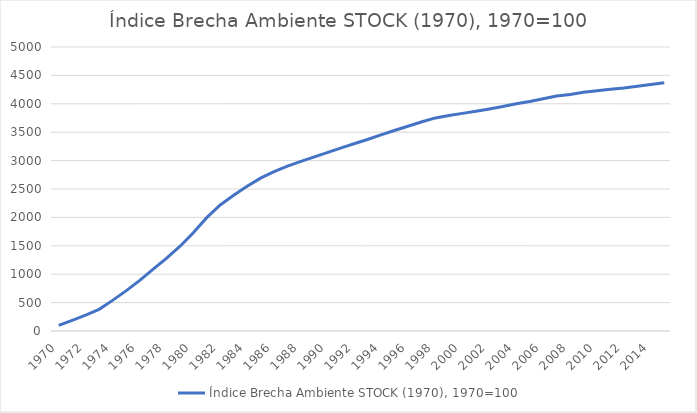
| Category | Índice Brecha Ambiente STOCK (1970), 1970=100 |
|---|---|
| 1970.0 | 100 |
| 1971.0 | 187.47 |
| 1972.0 | 279.454 |
| 1973.0 | 381.6 |
| 1974.0 | 539.063 |
| 1975.0 | 706.775 |
| 1976.0 | 886.064 |
| 1977.0 | 1083.732 |
| 1978.0 | 1278.035 |
| 1979.0 | 1488.049 |
| 1980.0 | 1728.891 |
| 1981.0 | 1995.949 |
| 1982.0 | 2217.792 |
| 1983.0 | 2391.362 |
| 1984.0 | 2546.946 |
| 1985.0 | 2690.364 |
| 1986.0 | 2806.794 |
| 1987.0 | 2903.179 |
| 1988.0 | 2985.188 |
| 1989.0 | 3064.533 |
| 1990.0 | 3143.667 |
| 1991.0 | 3223.863 |
| 1992.0 | 3301.514 |
| 1993.0 | 3375.401 |
| 1994.0 | 3455.941 |
| 1995.0 | 3534.718 |
| 1996.0 | 3608.66 |
| 1997.0 | 3683.702 |
| 1998.0 | 3751.486 |
| 1999.0 | 3794.749 |
| 2000.0 | 3831.441 |
| 2001.0 | 3868.664 |
| 2002.0 | 3909.637 |
| 2003.0 | 3954.014 |
| 2004.0 | 4000.533 |
| 2005.0 | 4040.72 |
| 2006.0 | 4088.842 |
| 2007.0 | 4135.692 |
| 2008.0 | 4162.911 |
| 2009.0 | 4202.336 |
| 2010.0 | 4228.816 |
| 2011.0 | 4255.681 |
| 2012.0 | 4277.449 |
| 2013.0 | 4309.742 |
| 2014.0 | 4340.399 |
| 2015.0 | 4371.41 |